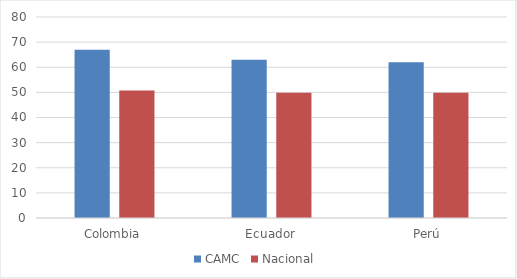
| Category | CAMC | Nacional  |
|---|---|---|
| Colombia | 67 | 50.781 |
| Ecuador | 63 | 49.889 |
| Perú | 62 | 49.885 |